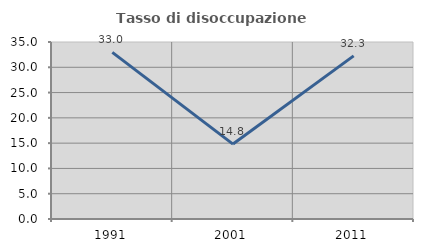
| Category | Tasso di disoccupazione giovanile  |
|---|---|
| 1991.0 | 32.955 |
| 2001.0 | 14.815 |
| 2011.0 | 32.258 |